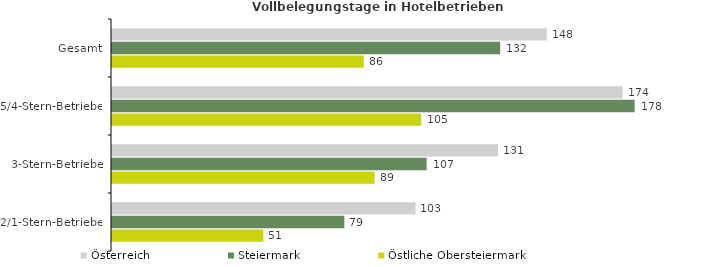
| Category | Österreich | Steiermark | Östliche Obersteiermark |
|---|---|---|---|
| Gesamt | 147.876 | 132.038 | 85.659 |
| 5/4-Stern-Betriebe | 173.697 | 177.779 | 105.173 |
| 3-Stern-Betriebe | 131.294 | 107.011 | 89.322 |
| 2/1-Stern-Betriebe | 103.222 | 79.024 | 51.481 |